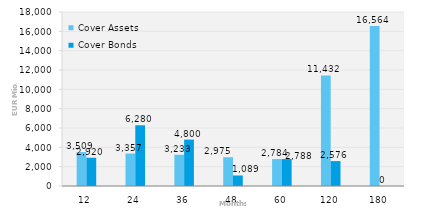
| Category | Cover Assets | Cover Bonds |
|---|---|---|
| 12.0 | 3508.867 | 2919.98 |
| 24.0 | 3356.824 | 6280 |
| 36.0 | 3233.423 | 4800 |
| 48.0 | 2974.638 | 1089.444 |
| 60.0 | 2784.472 | 2788 |
| 120.0 | 11431.568 | 2576.41 |
| 180.0 | 16563.826 | 0 |